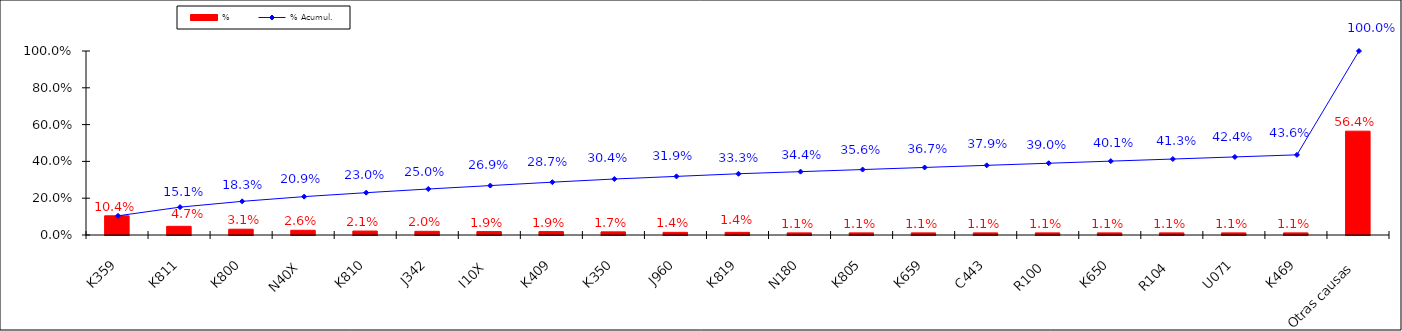
| Category | % |
|---|---|
| K359 | 0.104 |
| K811 | 0.047 |
| K800 | 0.031 |
| N40X | 0.026 |
| K810 | 0.021 |
| J342 | 0.02 |
| I10X | 0.019 |
| K409 | 0.019 |
| K350 | 0.017 |
| J960 | 0.014 |
| K819 | 0.014 |
| N180 | 0.011 |
| K805 | 0.011 |
| K659 | 0.011 |
| C443 | 0.011 |
| R100 | 0.011 |
| K650 | 0.011 |
| R104 | 0.011 |
| U071 | 0.011 |
| K469 | 0.011 |
| Otras causas | 0.564 |